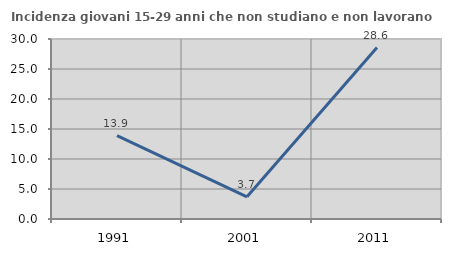
| Category | Incidenza giovani 15-29 anni che non studiano e non lavorano  |
|---|---|
| 1991.0 | 13.913 |
| 2001.0 | 3.704 |
| 2011.0 | 28.571 |